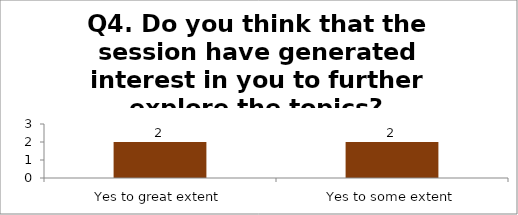
| Category | Q4. Do you think that the session have generated interest in you to further explore the topics? |
|---|---|
| Yes to great extent | 2 |
| Yes to some extent | 2 |